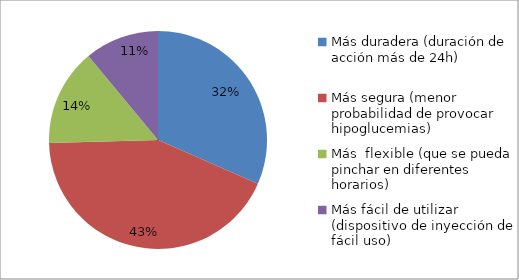
| Category | Series 0 | Series 1 | Series 2 |
|---|---|---|---|
| Más duradera (duración de acción más de 24h) |  |  | 149 |
| Más segura (menor probabilidad de provocar hipoglucemias) |  |  | 203 |
| Más  flexible (que se pueda pinchar en diferentes horarios) |  |  | 68 |
| Más fácil de utilizar (dispositivo de inyección de fácil uso) |  |  | 52 |